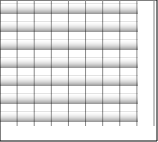
| Category | Series 0 |
|---|---|
| 0 | 8 |
| 1 | 8 |
| 2 | 8 |
| 3 | 8 |
| 4 | 8 |
| 5 | 8 |
| 6 | 8 |